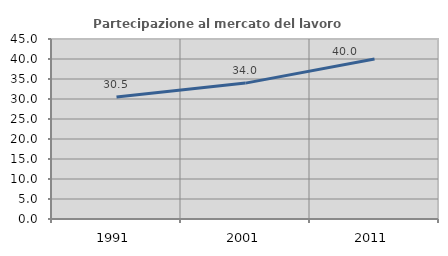
| Category | Partecipazione al mercato del lavoro  femminile |
|---|---|
| 1991.0 | 30.524 |
| 2001.0 | 33.972 |
| 2011.0 | 40.007 |